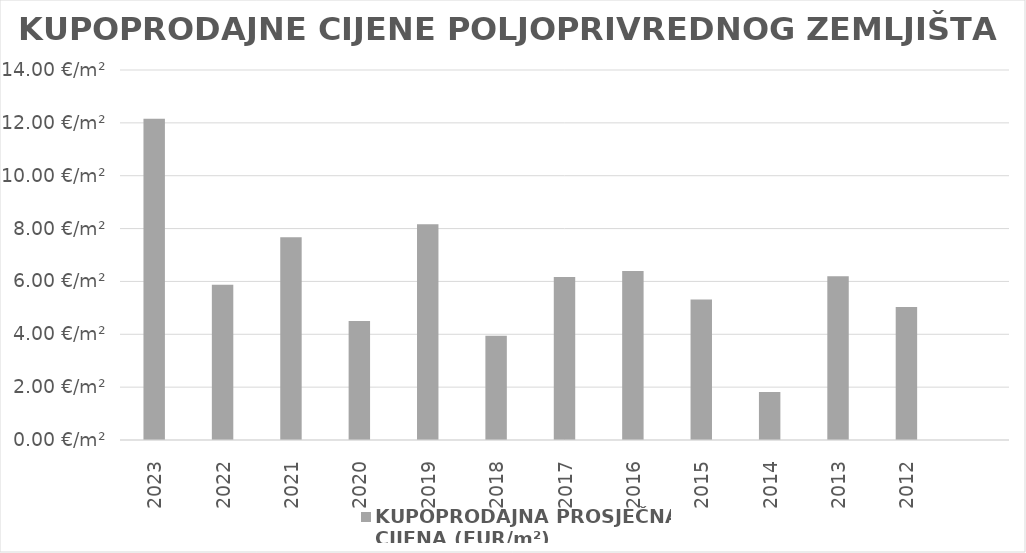
| Category | KUPOPRODAJNA PROSJEČNA 
CIJENA (EUR/m²) |
|---|---|
| 2023 | 1900-01-12 03:50:31 |
| 2022 | 1900-01-05 20:53:14 |
| 2021 | 1900-01-07 16:01:48 |
| 2020 | 1900-01-04 12:10:12 |
| 2019 | 1900-01-08 03:58:45 |
| 2018 | 1900-01-03 22:38:40 |
| 2017 | 1900-01-06 03:57:30 |
| 2016 | 1900-01-06 09:23:43 |
| 2015 | 1900-01-05 07:28:37 |
| 2014 | 1900-01-01 19:36:45 |
| 2013 | 1900-01-06 04:40:55 |
| 2012 | 1900-01-05 00:43:54 |